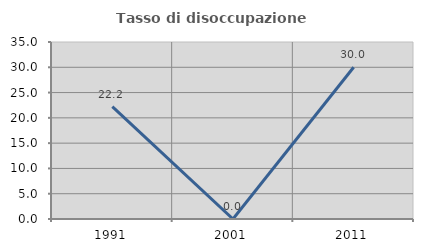
| Category | Tasso di disoccupazione giovanile  |
|---|---|
| 1991.0 | 22.222 |
| 2001.0 | 0 |
| 2011.0 | 30 |